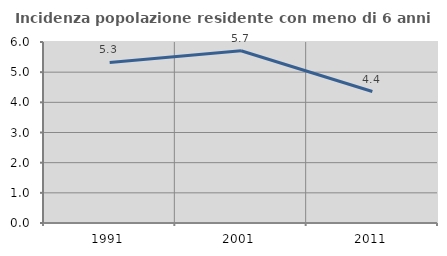
| Category | Incidenza popolazione residente con meno di 6 anni |
|---|---|
| 1991.0 | 5.321 |
| 2001.0 | 5.71 |
| 2011.0 | 4.359 |